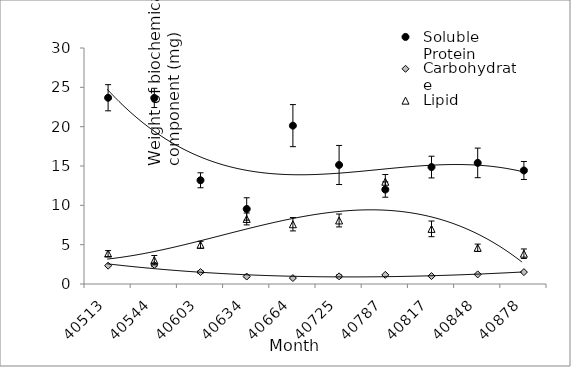
| Category | Soluble Protein | Carbohydrate | Lipid |
|---|---|---|---|
| 40513.0 | 23.677 | 2.33 | 3.872 |
| 40544.0 | 23.653 | 2.425 | 3.029 |
| 40603.0 | 13.186 | 1.516 | 4.984 |
| 40634.0 | 9.536 | 0.949 | 8.267 |
| 40664.0 | 20.131 | 0.756 | 7.597 |
| 40725.0 | 15.13 | 0.972 | 8.077 |
| 40787.0 | 12.007 | 1.165 | 13 |
| 40817.0 | 14.864 | 1.007 | 7.008 |
| 40848.0 | 15.394 | 1.222 | 4.6 |
| 40878.0 | 14.432 | 1.513 | 3.852 |